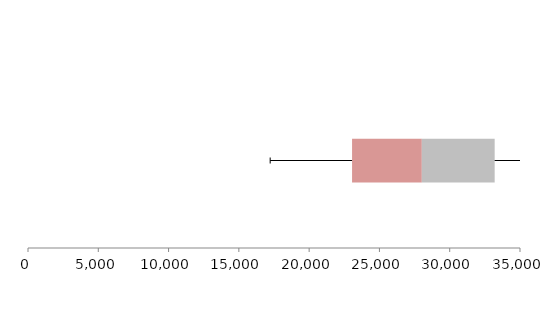
| Category | Series 1 | Series 2 | Series 3 |
|---|---|---|---|
| 0 | 23052.83 | 4963.259 | 5182.103 |